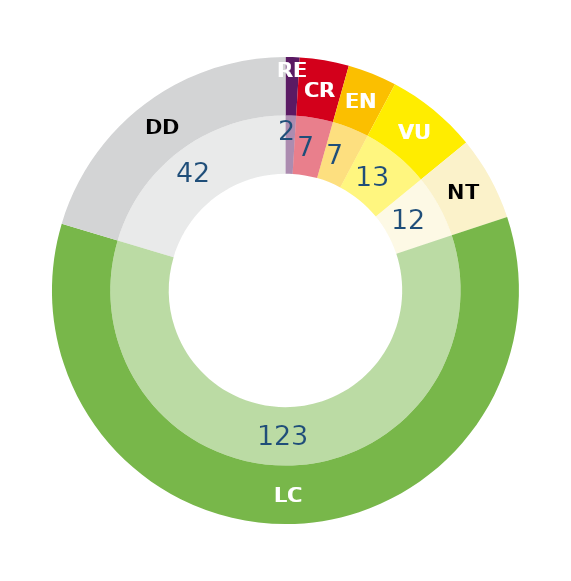
| Category | Series 1 | Series 0 |
|---|---|---|
| RE | 2 | 2 |
| CR | 7 | 7 |
| EN | 7 | 7 |
| VU | 13 | 13 |
| NT | 12 | 12 |
| LC | 123 | 123 |
| DD | 42 | 42 |